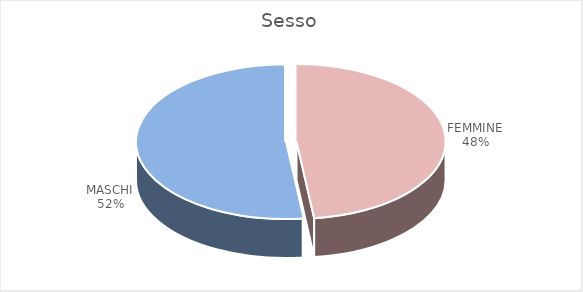
| Category | Series 0 |
|---|---|
| FEMMINE | 89 |
| MASCHI | 96 |